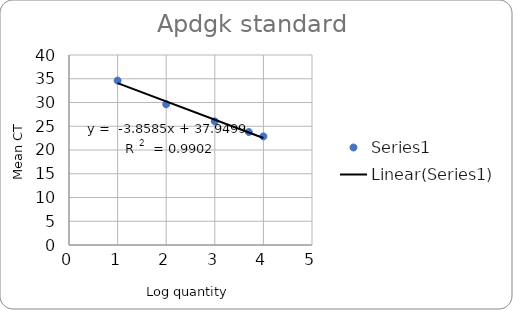
| Category | Series 0 |
|---|---|
| 4.0 | 22.858 |
| 3.698970004336019 | 23.785 |
| 3.0 | 26.026 |
| 2.0 | 29.613 |
| 1.0 | 34.61 |